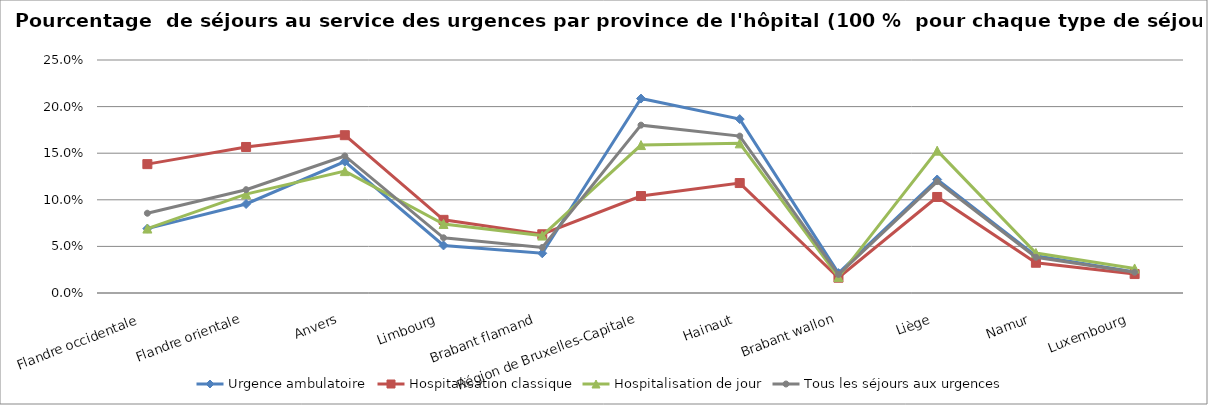
| Category | Urgence ambulatoire | Hospitalisation classique | Hospitalisation de jour | Tous les séjours aux urgences |
|---|---|---|---|---|
| Flandre occidentale | 0.069 | 0.138 | 0.069 | 0.086 |
| Flandre orientale | 0.095 | 0.157 | 0.106 | 0.111 |
| Anvers | 0.141 | 0.169 | 0.131 | 0.147 |
| Limbourg | 0.051 | 0.078 | 0.074 | 0.059 |
| Brabant flamand | 0.043 | 0.063 | 0.062 | 0.049 |
| Région de Bruxelles-Capitale | 0.209 | 0.104 | 0.159 | 0.18 |
| Hainaut | 0.187 | 0.118 | 0.161 | 0.168 |
| Brabant wallon | 0.021 | 0.016 | 0.017 | 0.02 |
| Liège | 0.122 | 0.103 | 0.153 | 0.12 |
| Namur | 0.04 | 0.032 | 0.043 | 0.038 |
| Luxembourg | 0.023 | 0.02 | 0.026 | 0.022 |